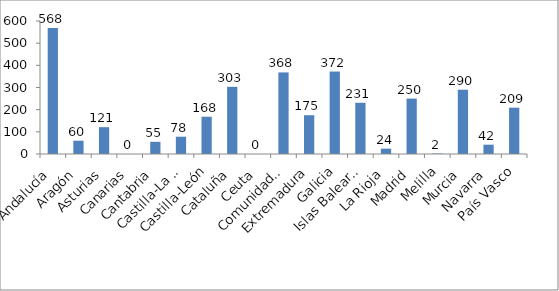
| Category | Series 0 |
|---|---|
| Andalucía | 568 |
| Aragón | 60 |
| Asturias | 121 |
| Canarias | 0 |
| Cantabria | 55 |
| Castilla-La Mancha | 78 |
| Castilla-León | 168 |
| Cataluña | 303 |
| Ceuta | 0 |
| Comunidad Valenciana | 368 |
| Extremadura | 175 |
| Galicia | 372 |
| Islas Baleares | 231 |
| La Rioja | 24 |
| Madrid | 250 |
| Melilla | 2 |
| Murcia | 290 |
| Navarra | 42 |
| País Vasco | 209 |